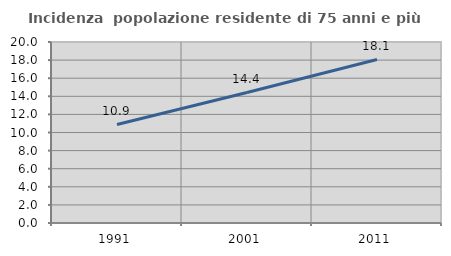
| Category | Incidenza  popolazione residente di 75 anni e più |
|---|---|
| 1991.0 | 10.886 |
| 2001.0 | 14.426 |
| 2011.0 | 18.069 |